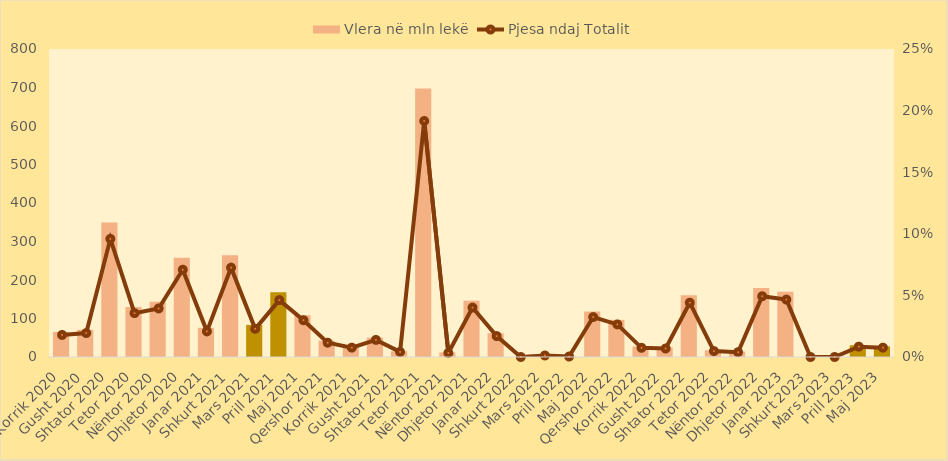
| Category | Vlera në mln lekë |
|---|---|
| Korrik 2020 | 65.205 |
| Gusht 2020 | 70.7 |
| Shtator 2020 | 349.195 |
| Tetor 2020 | 129.71 |
| Nëntor 2020 | 143.57 |
| Dhjetor 2020 | 258.055 |
| Janar 2021 | 75.853 |
| Shkurt 2021 | 264.11 |
| Mars 2021 | 83.405 |
| Prill 2021 | 168.143 |
| Maj 2021 | 108.643 |
| Qershor 2021 | 42.252 |
| Korrik 2021 | 27.673 |
| Gusht 2021 | 50.492 |
| Shtator 2021 | 15.05 |
| Tetor 2021 | 697.662 |
| Nëntor 2021 | 11.956 |
| Dhjetor 2021 | 146.16 |
| Janar 2022 | 61.857 |
| Shkurt 2022 | 0 |
| Mars 2022 | 4.451 |
| Prill 2022 | 1.44 |
| Maj 2022 | 118.1 |
| Qershor 2022 | 96.353 |
| Korrik 2022 | 27.154 |
| Gusht 2022 | 25.128 |
| Shtator 2022 | 160.465 |
| Tetor 2022 | 17.538 |
| Nëntor 2022 | 14.283 |
| Dhjetor 2022 | 179.51 |
| Janar 2023 | 169.756 |
| Shkurt 2023 | 0 |
| Mars 2023 | 0 |
| Prill 2023 | 30.552 |
| Maj 2023 | 27.585 |